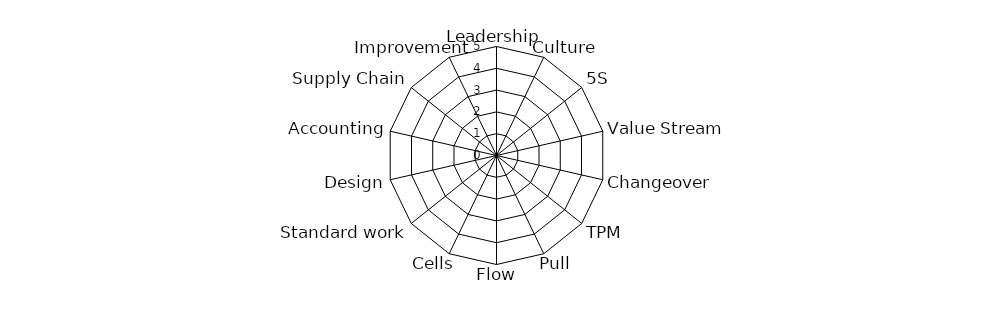
| Category | Series 0 | Series 1 | Series 2 | Series 3 | Series 4 | Series 5 |
|---|---|---|---|---|---|---|
| Leadership |  |  |  |  |  | 0 |
|  Culture |  |  |  |  |  | 0 |
|  5S |  |  |  |  |  | 0 |
|  Value Stream |  |  |  |  |  | 0 |
|  Changeover |  |  |  |  |  | 0 |
|  TPM |  |  |  |  |  | 0 |
|  Pull |  |  |  |  |  | 0 |
|  Flow |  |  |  |  |  | 0 |
|  Cells |  |  |  |  |  | 0 |
|  Standard work |  |  |  |  |  | 0 |
|  Design |  |  |  |  |  | 0 |
|  Accounting |  |  |  |  |  | 0 |
|  Supply Chain |  |  |  |  |  | 0 |
|  Improvement |  |  |  |  |  | 0 |